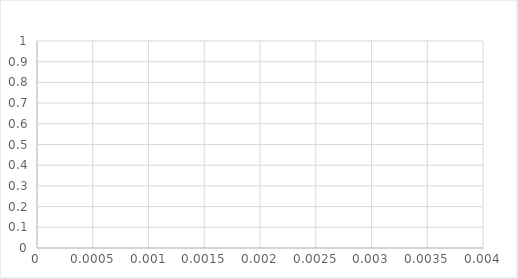
| Category | XY |
|---|---|
| 0.0036616623947272058 | 0 |